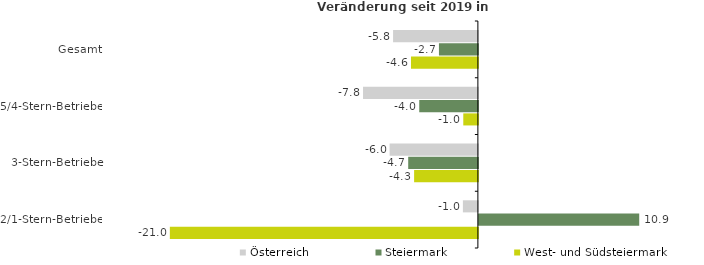
| Category | Österreich | Steiermark | West- und Südsteiermark |
|---|---|---|---|
| Gesamt | -5.779 | -2.653 | -4.557 |
| 5/4-Stern-Betriebe | -7.825 | -3.996 | -0.994 |
| 3-Stern-Betriebe | -6.014 | -4.748 | -4.345 |
| 2/1-Stern-Betriebe | -1.021 | 10.926 | -20.99 |